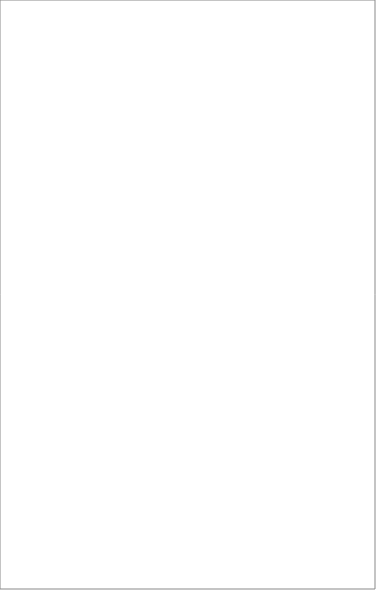
| Category | Series 0 |
|---|---|
| Ieslodzījumu vietas | 21443773 |
| Ugunsdrošības, ugunsdzēsības, glābšanas un civilās drošības dienesti | 27265908 |
| NBS atalgojums un pārstāvji ārvalstīs | 54992822 |
| Pilsonības un migrācijas lietas | 6109389 |
| Policija | 68606450 |
| NBS uzturēšana | 60188834 |
| Civilā aizsardzība un Jaunsardzes centra darbība | 1953528 |
| Atbalsts sabiedriskās kārtības nodrošināšanai - Tiesu izpildītāji un ekspertīzes, juridiskā palīdzība | 2042738 |
| Robežsardze | 19840846 |
| Atbalsts sabiedriskai kārtībai un drošībai - IeM komunikācijas, īpašumu pārvaldīšana, lietisko pierādījumu glabāšana un AizM militārā izlūkošana | 21933394 |